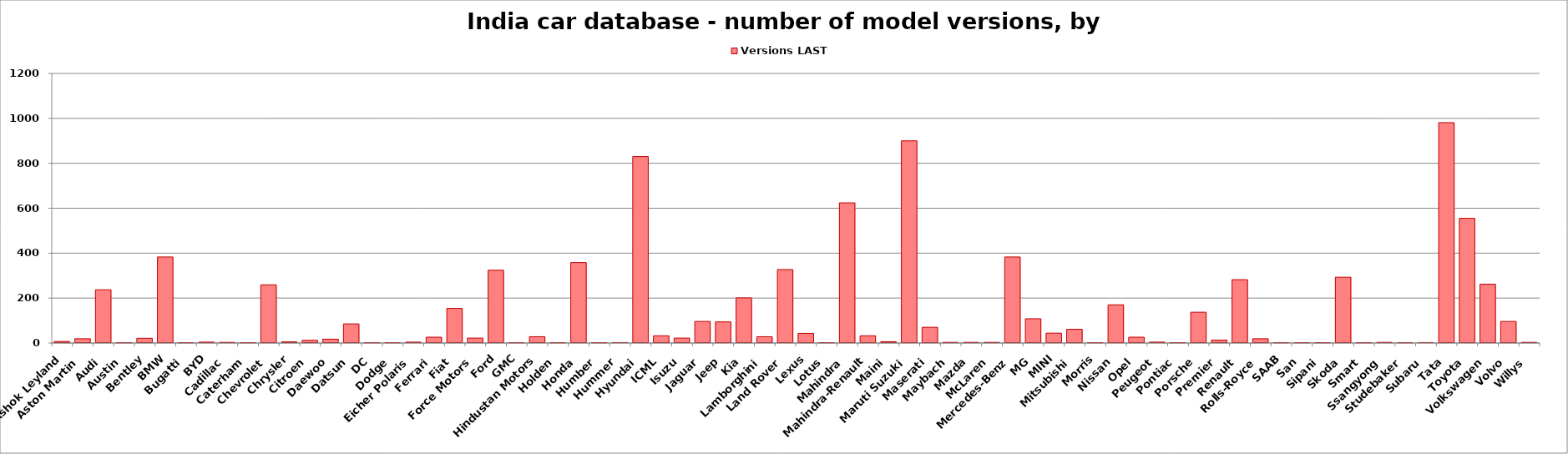
| Category | Versions LAST |
|---|---|
| Ashok Leyland | 7 |
| Aston Martin | 19 |
| Audi | 237 |
| Austin | 1 |
| Bentley | 21 |
| BMW | 383 |
| Bugatti | 1 |
| BYD | 4 |
| Cadillac | 3 |
| Caterham | 1 |
| Chevrolet | 259 |
| Chrysler | 5 |
| Citroen | 12 |
| Daewoo | 17 |
| Datsun | 85 |
| DC | 1 |
| Dodge | 1 |
| Eicher Polaris | 4 |
| Ferrari | 26 |
| Fiat | 154 |
| Force Motors | 22 |
| Ford | 324 |
| GMC | 1 |
| Hindustan Motors | 28 |
| Holden | 1 |
| Honda | 358 |
| Humber | 1 |
| Hummer | 2 |
| Hyundai | 830 |
| ICML | 32 |
| Isuzu | 22 |
| Jaguar | 96 |
| Jeep | 94 |
| Kia | 201 |
| Lamborghini | 28 |
| Land Rover | 327 |
| Lexus | 43 |
| Lotus | 1 |
| Mahindra | 624 |
| Mahindra-Renault | 32 |
| Maini | 6 |
| Maruti Suzuki | 900 |
| Maserati | 70 |
| Maybach | 3 |
| Mazda | 3 |
| McLaren | 3 |
| Mercedes-Benz | 383 |
| MG | 108 |
| MINI | 44 |
| Mitsubishi | 61 |
| Morris | 1 |
| Nissan | 170 |
| Opel | 26 |
| Peugeot | 4 |
| Pontiac | 1 |
| Porsche | 137 |
| Premier | 13 |
| Renault | 282 |
| Rolls-Royce | 19 |
| SAAB | 1 |
| San | 1 |
| Sipani | 1 |
| Skoda | 293 |
| Smart | 1 |
| Ssangyong | 3 |
| Studebaker | 1 |
| Subaru | 2 |
| Tata | 981 |
| Toyota | 555 |
| Volkswagen | 262 |
| Volvo | 96 |
| Willys | 3 |